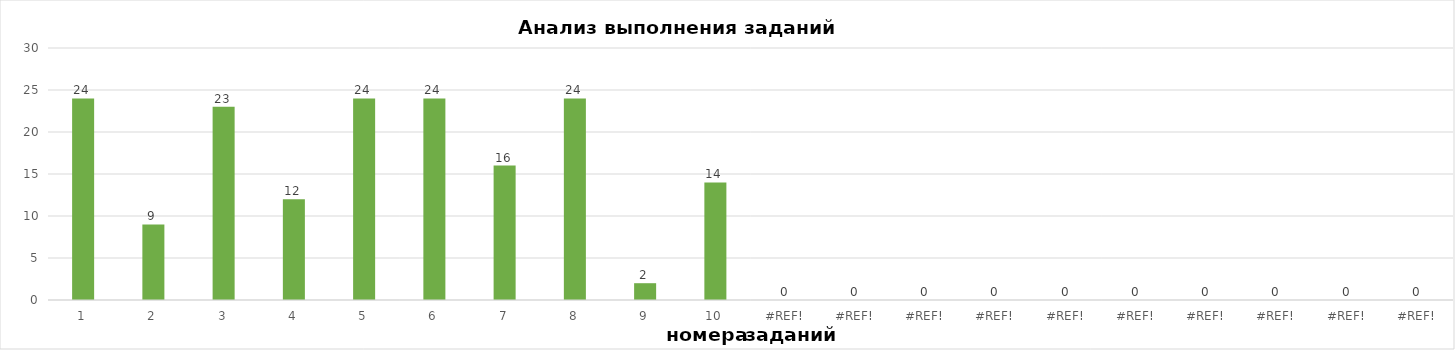
| Category | задания |
|---|---|
| 1.0 | 24 |
| 2.0 | 9 |
| 3.0 | 23 |
| 4.0 | 12 |
| 5.0 | 24 |
| 6.0 | 24 |
| 7.0 | 16 |
| 8.0 | 24 |
| 9.0 | 2 |
| 10.0 | 14 |
| 0.0 | 0 |
| 0.0 | 0 |
| 0.0 | 0 |
| 0.0 | 0 |
| 0.0 | 0 |
| 0.0 | 0 |
| 0.0 | 0 |
| 0.0 | 0 |
| 0.0 | 0 |
| 0.0 | 0 |